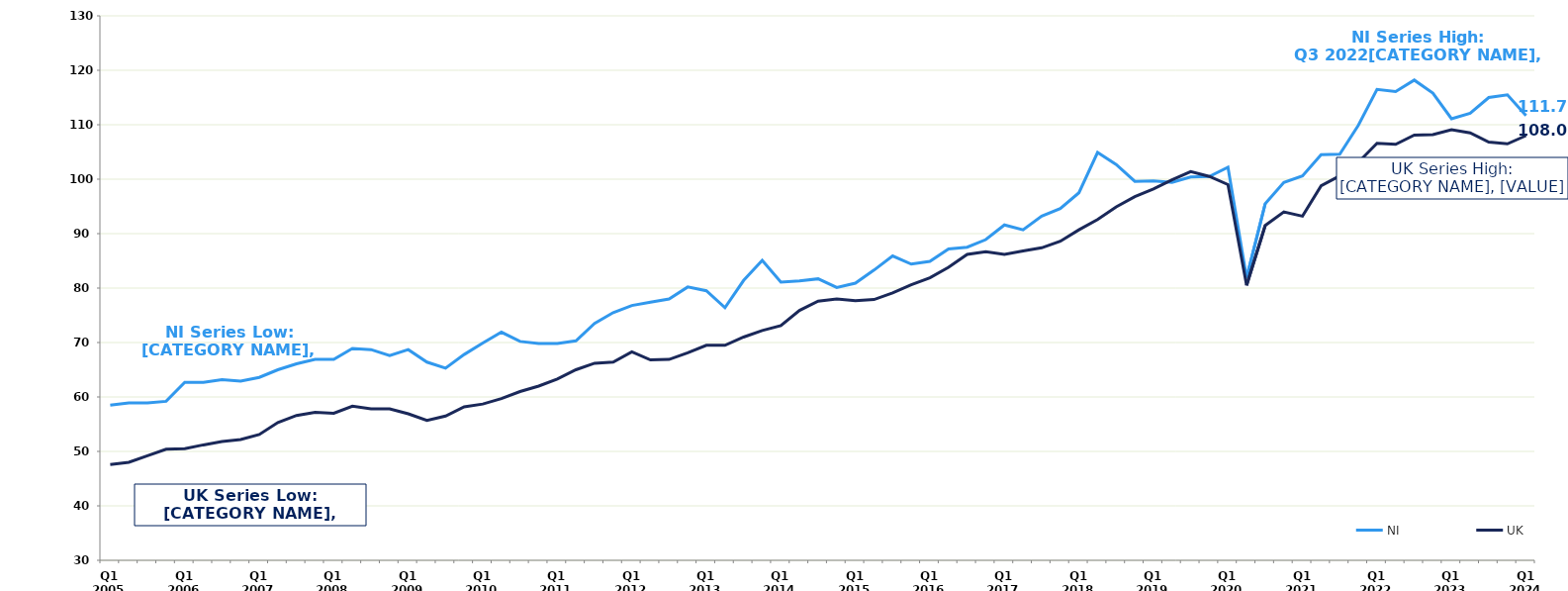
| Category | NI | UK |
|---|---|---|
| Q1 2005 | 58.5 | 47.6 |
|  | 58.9 | 48 |
|  | 58.9 | 49.2 |
|  | 59.2 | 50.4 |
| Q1 2006 | 62.7 | 50.5 |
|  | 62.7 | 51.2 |
|  | 63.2 | 51.8 |
|  | 62.9 | 52.2 |
| Q1 2007 | 63.6 | 53.1 |
|  | 65 | 55.3 |
|  | 66.1 | 56.6 |
|  | 66.9 | 57.2 |
| Q1 2008 | 66.9 | 57 |
|  | 68.9 | 58.3 |
|  | 68.7 | 57.8 |
|  | 67.6 | 57.8 |
| Q1 2009 | 68.7 | 56.9 |
|  | 66.4 | 55.7 |
|  | 65.3 | 56.5 |
|  | 67.8 | 58.2 |
| Q1 2010 | 69.9 | 58.7 |
|  | 71.9 | 59.7 |
|  | 70.2 | 61 |
|  | 69.8 | 62 |
| Q1 2011 | 69.8 | 63.3 |
|  | 70.3 | 65 |
|  | 73.5 | 66.2 |
|  | 75.5 | 66.4 |
| Q1 2012 | 76.8 | 68.3 |
|  | 77.4 | 66.8 |
|  | 78 | 66.9 |
|  | 80.2 | 68.1 |
| Q1 2013 | 79.5 | 69.5 |
|  | 76.4 | 69.5 |
|  | 81.4 | 71 |
|  | 85.1 | 72.2 |
| Q1 2014 | 81.1 | 73.1 |
|  | 81.3 | 75.9 |
|  | 81.7 | 77.6 |
|  | 80.1 | 78 |
| Q1 2015 | 80.9 | 77.7 |
|  | 83.3 | 77.9 |
|  | 85.9 | 79.1 |
|  | 84.4 | 80.6 |
| Q1 2016 | 84.9 | 81.9 |
|  | 87.2 | 83.8 |
|  | 87.5 | 86.2 |
|  | 88.9 | 86.7 |
| Q1 2017 | 91.6 | 86.2 |
|  | 90.7 | 86.8 |
|  | 93.2 | 87.4 |
|  | 94.6 | 88.6 |
| Q1 2018 | 97.5 | 90.7 |
|  | 104.9 | 92.6 |
|  | 102.7 | 94.9 |
|  | 99.6 | 96.8 |
| Q1 2019 | 99.7 | 98.2 |
|  | 99.4 | 99.9 |
|  | 100.4 | 101.4 |
|  | 100.5 | 100.5 |
| Q1 2020 | 102.2 | 99 |
|  | 81.9 | 80.5 |
|  | 95.5 | 91.5 |
|  | 99.4 | 94 |
| Q1 2021 | 100.6 | 93.2 |
|  | 104.5 | 98.8 |
|  | 104.6 | 100.6 |
|  | 109.9 | 103.1 |
| Q1 2022 | 116.5 | 106.6 |
|  | 116.1 | 106.4 |
|  | 118.2 | 108.1 |
|  | 115.8 | 108.2 |
| Q1 2023 | 111.1 | 109.1 |
|  | 112.1 | 108.5 |
|  | 115 | 106.8 |
|  | 115.5 | 106.5 |
| Q1 2024 | 111.7 | 108 |